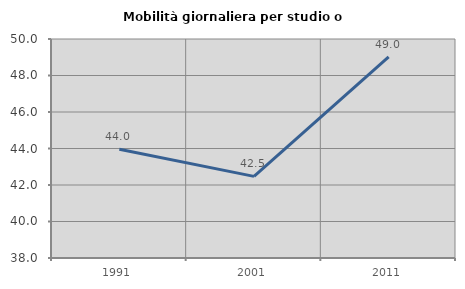
| Category | Mobilità giornaliera per studio o lavoro |
|---|---|
| 1991.0 | 43.962 |
| 2001.0 | 42.473 |
| 2011.0 | 49.014 |